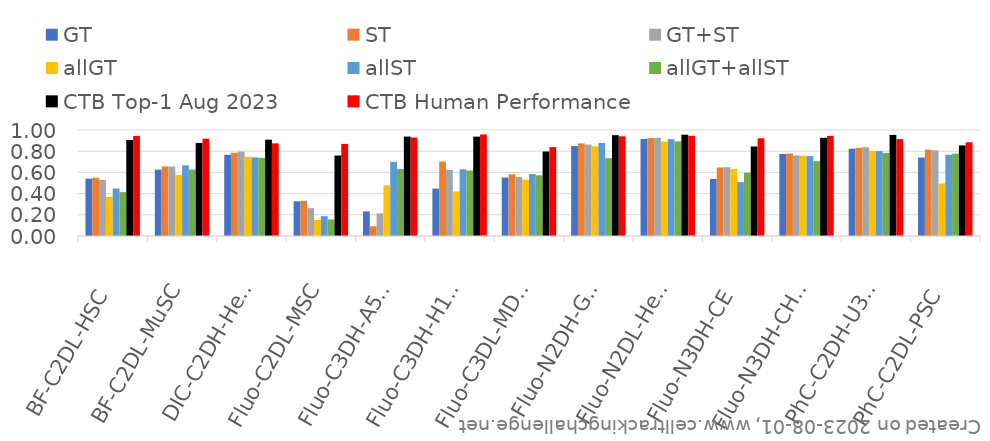
| Category | GT | ST | GT+ST | allGT | allST | allGT+allST | CTB Top-1 Aug 2023 | CTB Human Performance |
|---|---|---|---|---|---|---|---|---|
| BF-C2DL-HSC | 0.541 | 0.55 | 0.53 | 0.37 | 0.448 | 0.414 | 0.906 | 0.944 |
| BF-C2DL-MuSC | 0.626 | 0.656 | 0.656 | 0.577 | 0.667 | 0.627 | 0.878 | 0.918 |
| DIC-C2DH-HeLa | 0.767 | 0.785 | 0.796 | 0.746 | 0.742 | 0.738 | 0.909 | 0.874 |
| Fluo-C2DL-MSC | 0.327 | 0.332 | 0.263 | 0.151 | 0.187 | 0.156 | 0.759 | 0.869 |
| Fluo-C3DH-A549 | 0.232 | 0.092 | 0.213 | 0.477 | 0.699 | 0.633 | 0.938 | 0.929 |
| Fluo-C3DH-H157 | 0.447 | 0.702 | 0.624 | 0.421 | 0.63 | 0.618 | 0.938 | 0.958 |
| Fluo-C3DL-MDA231 | 0.552 | 0.582 | 0.556 | 0.53 | 0.585 | 0.573 | 0.797 | 0.838 |
| Fluo-N2DH-GOWT1 | 0.849 | 0.874 | 0.863 | 0.847 | 0.879 | 0.734 | 0.951 | 0.941 |
| Fluo-N2DL-HeLa | 0.916 | 0.923 | 0.927 | 0.892 | 0.914 | 0.892 | 0.956 | 0.946 |
| Fluo-N3DH-CE | 0.538 | 0.647 | 0.65 | 0.633 | 0.509 | 0.596 | 0.844 | 0.922 |
| Fluo-N3DH-CHO | 0.774 | 0.778 | 0.76 | 0.757 | 0.754 | 0.706 | 0.926 | 0.944 |
| PhC-C2DH-U373 | 0.823 | 0.832 | 0.838 | 0.802 | 0.802 | 0.784 | 0.954 | 0.914 |
| PhC-C2DL-PSC | 0.74 | 0.814 | 0.808 | 0.496 | 0.766 | 0.777 | 0.855 | 0.884 |